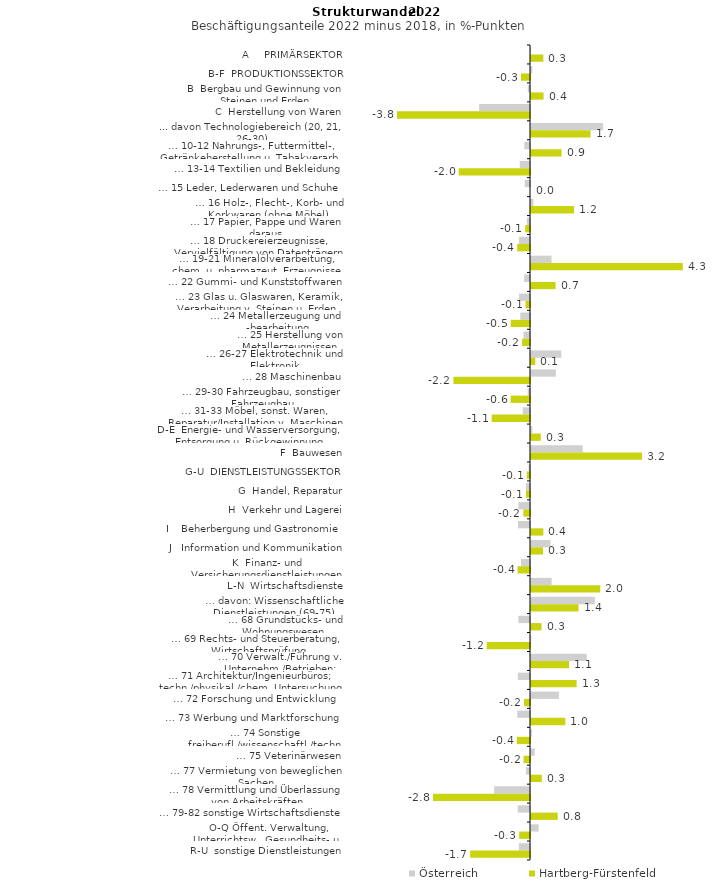
| Category | Österreich | Hartberg-Fürstenfeld |
|---|---|---|
| A     PRIMÄRSEKTOR | 0.004 | 0.35 |
| B-F  PRODUKTIONSSEKTOR | 0.036 | -0.257 |
| B  Bergbau und Gewinnung von Steinen und Erden | -0.063 | 0.357 |
| C  Herstellung von Waren | -1.445 | -3.779 |
| ... davon Technologiebereich (20, 21, 26-30) | 2.047 | 1.692 |
| … 10-12 Nahrungs-, Futtermittel-, Getränkeherstellung u. Tabakverarb. | -0.163 | 0.87 |
| … 13-14 Textilien und Bekleidung | -0.292 | -2.026 |
| … 15 Leder, Lederwaren und Schuhe | -0.15 | 0 |
| … 16 Holz-, Flecht-, Korb- und Korkwaren (ohne Möbel)  | 0.068 | 1.221 |
| … 17 Papier, Pappe und Waren daraus  | -0.09 | -0.137 |
| … 18 Druckereierzeugnisse, Vervielfältigung von Datenträgern | -0.314 | -0.364 |
| … 19-21 Mineralölverarbeitung, chem. u. pharmazeut. Erzeugnisse | 0.584 | 4.313 |
| … 22 Gummi- und Kunststoffwaren | -0.168 | 0.698 |
| … 23 Glas u. Glaswaren, Keramik, Verarbeitung v. Steinen u. Erden  | -0.312 | -0.128 |
| … 24 Metallerzeugung und -bearbeitung | -0.276 | -0.547 |
| … 25 Herstellung von Metallerzeugnissen  | -0.185 | -0.225 |
| … 26-27 Elektrotechnik und Elektronik | 0.862 | 0.122 |
| … 28 Maschinenbau | 0.705 | -2.175 |
| … 29-30 Fahrzeugbau, sonstiger Fahrzeugbau | -0.066 | -0.55 |
| … 31-33 Möbel, sonst. Waren, Reparatur/Installation v. Maschinen | -0.204 | -1.089 |
| D-E  Energie- und Wasserversorgung, Entsorgung u. Rückgewinnung | 0.038 | 0.278 |
| F  Bauwesen | 1.469 | 3.155 |
| G-U  DIENSTLEISTUNGSSEKTOR | -0.04 | -0.089 |
| G  Handel, Reparatur | -0.115 | -0.114 |
| H  Verkehr und Lagerei | -0.33 | -0.189 |
| I    Beherbergung und Gastronomie | -0.34 | 0.351 |
| J   Information und Kommunikation | 0.551 | 0.343 |
| K  Finanz- und Versicherungsdienstleistungen | -0.255 | -0.351 |
| L-N  Wirtschaftsdienste | 0.586 | 1.968 |
| … davon: Wissenschaftliche Dienstleistungen (69-75) | 1.815 | 1.352 |
| … 68 Grundstücks- und Wohnungswesen  | -0.331 | 0.3 |
| … 69 Rechts- und Steuerberatung, Wirtschaftsprüfung | 0.008 | -1.23 |
| … 70 Verwalt./Führung v. Unternehm./Betrieben; Unternehmensberat. | 1.583 | 1.08 |
| … 71 Architektur/Ingenieurbüros; techn./physikal./chem. Untersuchung | -0.344 | 1.295 |
| … 72 Forschung und Entwicklung  | 0.797 | -0.171 |
| … 73 Werbung und Marktforschung | -0.361 | 0.975 |
| … 74 Sonstige freiberufl./wissenschaftl./techn. Tätigkeiten | 0.025 | -0.376 |
| … 75 Veterinärwesen | 0.108 | -0.184 |
| … 77 Vermietung von beweglichen Sachen  | -0.116 | 0.308 |
| … 78 Vermittlung und Überlassung von Arbeitskräften | -1.018 | -2.757 |
| … 79-82 sonstige Wirtschaftsdienste | -0.351 | 0.759 |
| O-Q Öffent. Verwaltung, Unterrichtsw., Gesundheits- u. Sozialwesen | 0.216 | -0.308 |
| R-U  sonstige Dienstleistungen | -0.314 | -1.701 |